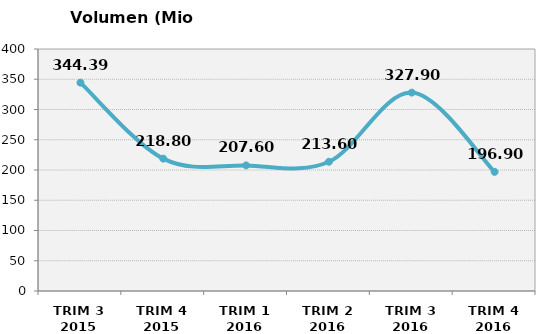
| Category | Volumen (Mio consumiciones) |
|---|---|
| TRIM 3 2015 | 344.386 |
| TRIM 4 2015 | 218.797 |
| TRIM 1 2016 | 207.6 |
| TRIM 2 2016 | 213.6 |
| TRIM 3 2016 | 327.9 |
| TRIM 4 2016 | 196.9 |